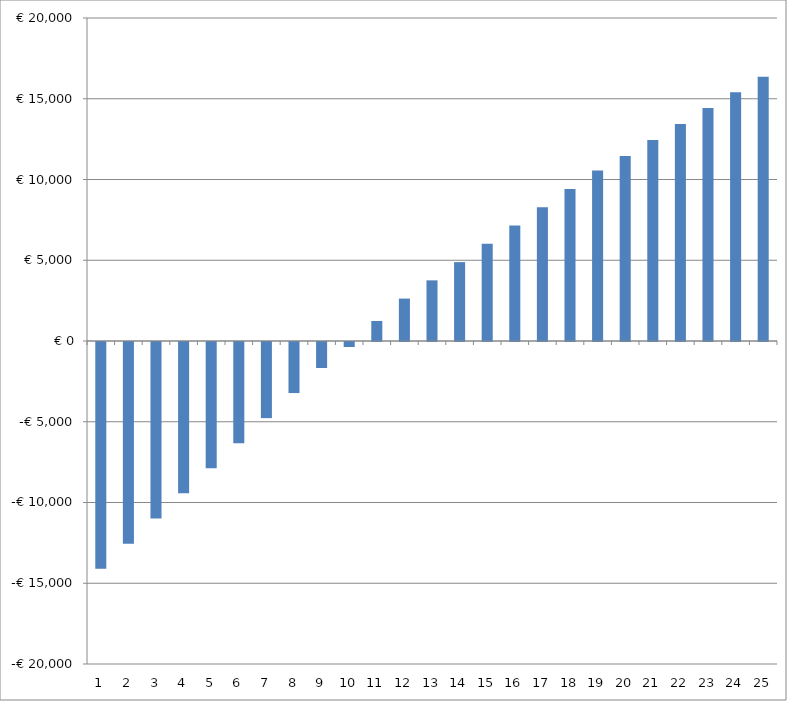
| Category | Series 0 |
|---|---|
| 0 | -14046.444 |
| 1 | -12486.104 |
| 2 | -10928.005 |
| 3 | -9371.87 |
| 4 | -7817.417 |
| 5 | -6264.357 |
| 6 | -4712.397 |
| 7 | -3161.237 |
| 8 | -1610.571 |
| 9 | -310.085 |
| 10 | 1240.538 |
| 11 | 2626.775 |
| 12 | 3754.759 |
| 13 | 4883.88 |
| 14 | 6014.487 |
| 15 | 7146.935 |
| 16 | 8281.587 |
| 17 | 9418.817 |
| 18 | 10559.005 |
| 19 | 11452.542 |
| 20 | 12450.555 |
| 21 | 13443.298 |
| 22 | 14427.833 |
| 23 | 15400.958 |
| 24 | 16359.183 |